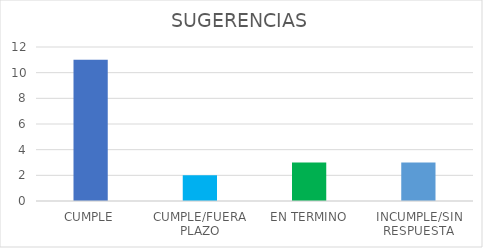
| Category | Series 0 |
|---|---|
| CUMPLE | 11 |
| CUMPLE/FUERA PLAZO | 2 |
| EN TERMINO | 3 |
| INCUMPLE/SIN RESPUESTA | 3 |